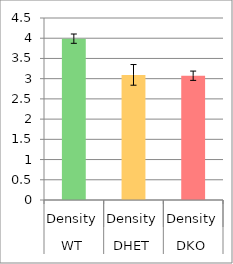
| Category | Series 0 |
|---|---|
| 0 | 3.989 |
| 1 | 3.094 |
| 2 | 3.073 |